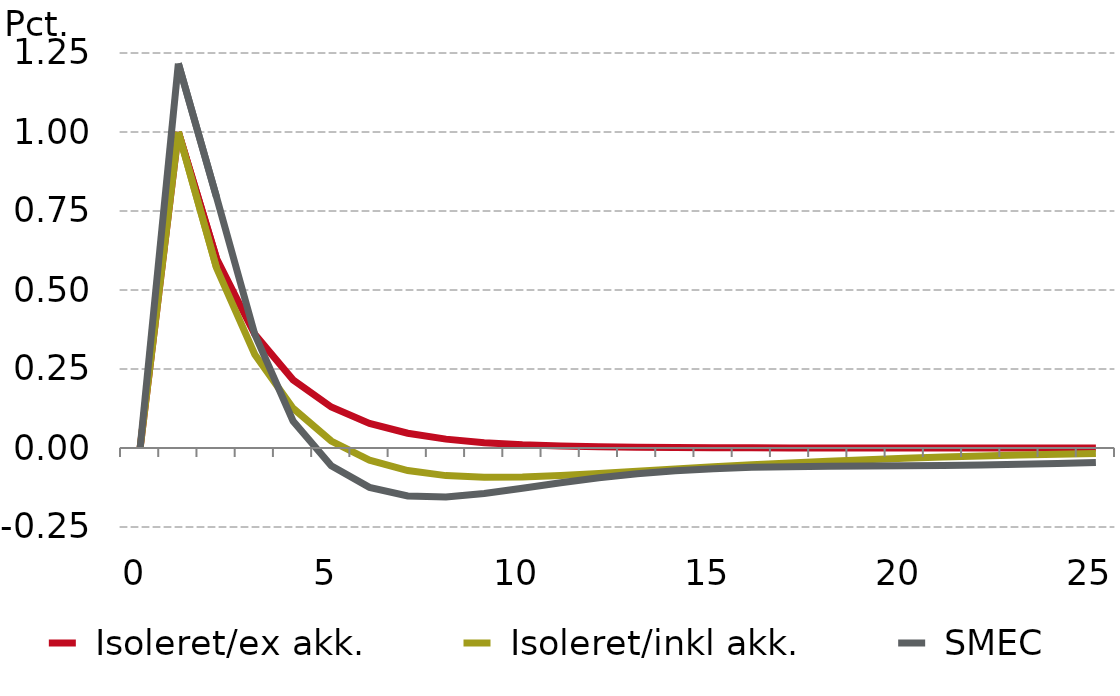
| Category |  Isoleret/ex akk. |  Isoleret/inkl akk. |  SMEC |
|---|---|---|---|
| 0.0 | 0 | 0 | 0 |
| nan | 1 | 1 | 1.217 |
| nan | 0.599 | 0.569 | 0.794 |
| nan | 0.36 | 0.296 | 0.36 |
| nan | 0.216 | 0.126 | 0.085 |
| 5.0 | 0.13 | 0.022 | -0.056 |
| nan | 0.078 | -0.038 | -0.125 |
| nan | 0.047 | -0.071 | -0.152 |
| nan | 0.028 | -0.087 | -0.155 |
| nan | 0.017 | -0.093 | -0.144 |
| 10.0 | 0.01 | -0.092 | -0.128 |
| nan | 0.006 | -0.087 | -0.11 |
| nan | 0.004 | -0.081 | -0.094 |
| nan | 0.002 | -0.074 | -0.081 |
| nan | 0.001 | -0.067 | -0.072 |
| 15.0 | 0.001 | -0.06 | -0.065 |
| nan | 0 | -0.053 | -0.061 |
| nan | 0 | -0.047 | -0.059 |
| nan | 0 | -0.042 | -0.058 |
| nan | 0 | -0.037 | -0.057 |
| 20.0 | 0 | -0.033 | -0.056 |
| nan | 0 | -0.029 | -0.055 |
| nan | 0 | -0.025 | -0.054 |
| nan | 0 | -0.022 | -0.052 |
| nan | 0 | -0.02 | -0.049 |
| 25.0 | 0 | -0.017 | -0.046 |